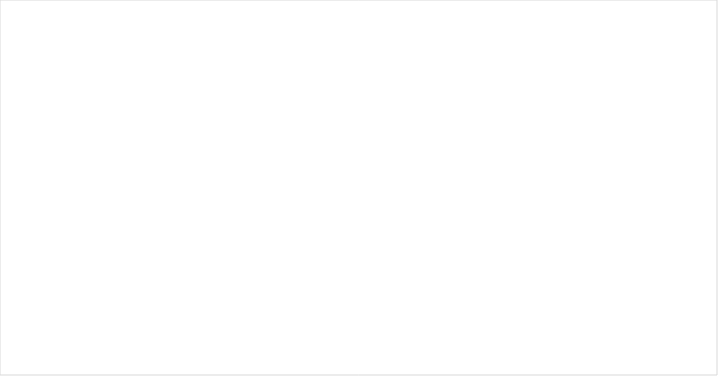
| Category | Reguliere verwijzing | Terugverwijzing | Verwijzing naar advocatuur |
|---|---|---|---|
| 2012 | 58532 | 46756 | 105288 |
| 2013 | 48952 | 84118 | 133070 |
| 2014 | 40891 | 89123 | 130014 |
| 2015 | 37025 | 91177 | 128202 |
| 2016 | 35711 | 93397 | 129108 |
| 2017 | 33704 | 93081 | 126785 |
| 2018 | 33817 | 87505 | 121322 |
| 2019 | 34853 | 81195 | 116048 |
| 2020 | 18185 | 21886 | 40071 |
| 2021 | 12863 | 1752 | 14615 |
| 2022 | 16078 | 3318 | 19396 |